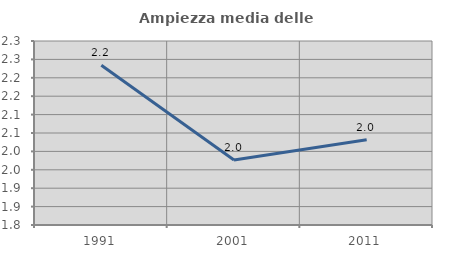
| Category | Ampiezza media delle famiglie |
|---|---|
| 1991.0 | 2.234 |
| 2001.0 | 1.977 |
| 2011.0 | 2.032 |